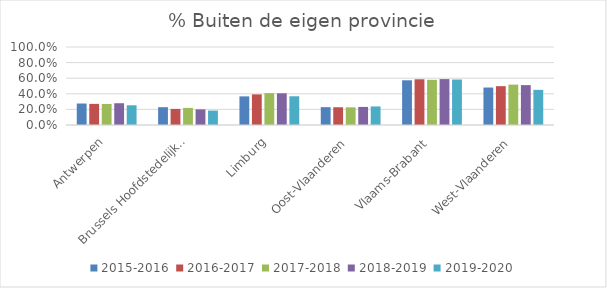
| Category | 2015-2016 | 2016-2017 | 2017-2018 | 2018-2019 | 2019-2020 |
|---|---|---|---|---|---|
| Antwerpen | 0.275 | 0.271 | 0.27 | 0.279 | 0.253 |
| Brussels Hoofdstedelijk Gewest | 0.228 | 0.206 | 0.219 | 0.201 | 0.185 |
| Limburg | 0.367 | 0.393 | 0.409 | 0.407 | 0.368 |
| Oost-Vlaanderen | 0.229 | 0.228 | 0.227 | 0.232 | 0.238 |
| Vlaams-Brabant | 0.573 | 0.586 | 0.579 | 0.589 | 0.583 |
| West-Vlaanderen | 0.48 | 0.498 | 0.518 | 0.511 | 0.45 |